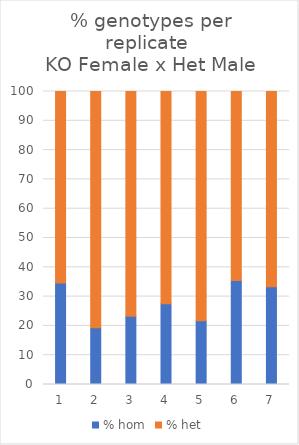
| Category | % hom | % het |
|---|---|---|
| 0 | 34.615 | 65.385 |
| 1 | 19.355 | 80.645 |
| 2 | 23.333 | 76.667 |
| 3 | 27.586 | 72.414 |
| 4 | 21.739 | 78.261 |
| 5 | 35.484 | 64.516 |
| 6 | 33.333 | 66.667 |